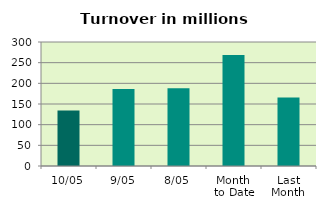
| Category | Series 0 |
|---|---|
| 10/05 | 134.448 |
| 9/05 | 186.185 |
| 8/05 | 188.008 |
| Month 
to Date | 268.304 |
| Last
Month | 165.638 |